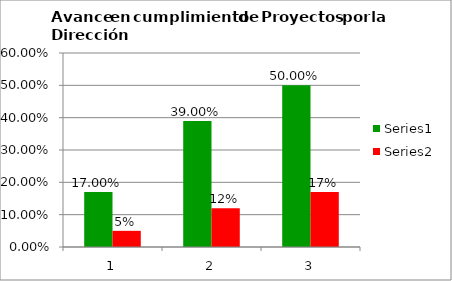
| Category | Series 0 | Series 1 |
|---|---|---|
| 0 | 0.17 | 0.05 |
| 1 | 0.39 | 0.12 |
| 2 | 0.5 | 0.17 |